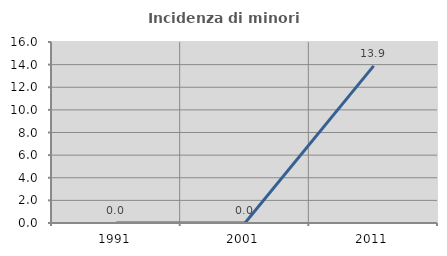
| Category | Incidenza di minori stranieri |
|---|---|
| 1991.0 | 0 |
| 2001.0 | 0 |
| 2011.0 | 13.889 |